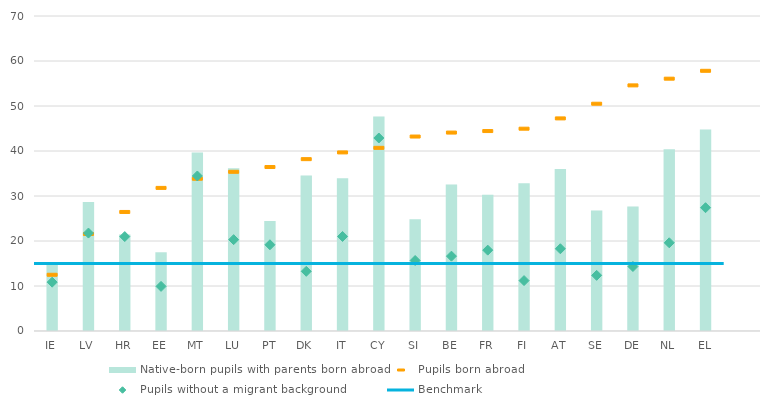
| Category | Native-born pupils with parents born abroad |
|---|---|
| 0 | 15.208 |
| 1 | 28.687 |
| 2 | 21.418 |
| 3 | 17.496 |
| 4 | 39.639 |
| 5 | 36.184 |
| 6 | 24.431 |
| 7 | 34.559 |
| 8 | 33.944 |
| 9 | 47.671 |
| 10 | 24.851 |
| 11 | 32.532 |
| 12 | 30.28 |
| 13 | 32.839 |
| 14 | 35.994 |
| 15 | 26.754 |
| 16 | 27.652 |
| 17 | 40.392 |
| 18 | 44.8 |